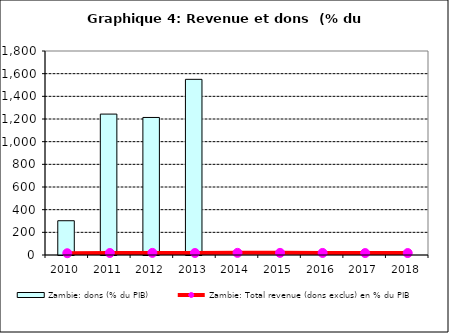
| Category | Zambie: dons (% du PIB) |
|---|---|
| 2010.0 | 302.42 |
| 2011.0 | 1243.371 |
| 2012.0 | 1213.584 |
| 2013.0 | 1549.932 |
| 2014.0 | 0 |
| 2015.0 | 0 |
| 2016.0 | 0 |
| 2017.0 | 0 |
| 2018.0 | 0 |